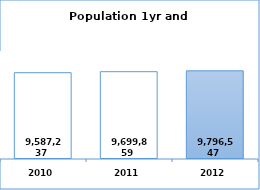
| Category | Chosen | Unchosen |
|---|---|---|
| 2010.0 | 0 | 9587237 |
| 2011.0 | 0 | 9699859 |
| 2012.0 | 9796547 | 0 |